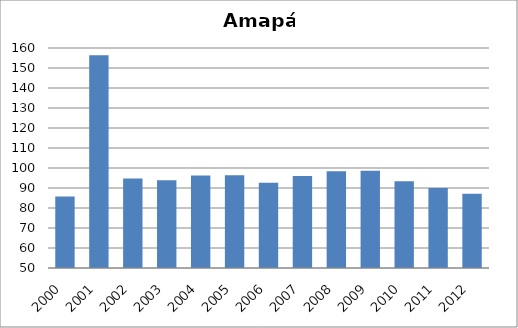
| Category | Tetravalente/DTP |
|---|---|
| 2000.0 | 85.73 |
| 2001.0 | 156.41 |
| 2002.0 | 94.77 |
| 2003.0 | 93.92 |
| 2004.0 | 96.28 |
| 2005.0 | 96.39 |
| 2006.0 | 92.58 |
| 2007.0 | 95.99 |
| 2008.0 | 98.37 |
| 2009.0 | 98.57 |
| 2010.0 | 93.43 |
| 2011.0 | 89.94 |
| 2012.0 | 87.16 |